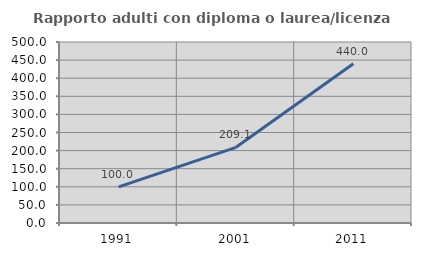
| Category | Rapporto adulti con diploma o laurea/licenza media  |
|---|---|
| 1991.0 | 100 |
| 2001.0 | 209.091 |
| 2011.0 | 440 |